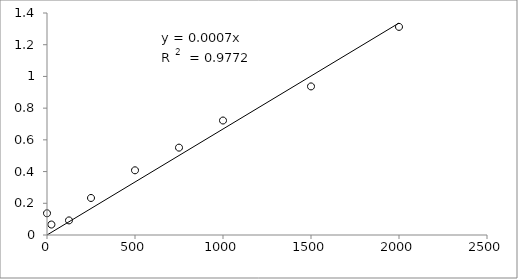
| Category | Series 0 |
|---|---|
| 2000.0 | 1.312 |
| 1500.0 | 0.937 |
| 1000.0 | 0.722 |
| 750.0 | 0.551 |
| 500.0 | 0.408 |
| 250.0 | 0.233 |
| 125.0 | 0.092 |
| 25.0 | 0.066 |
| 0.0 | 0.137 |